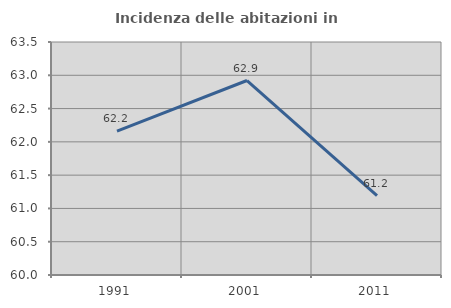
| Category | Incidenza delle abitazioni in proprietà  |
|---|---|
| 1991.0 | 62.162 |
| 2001.0 | 62.921 |
| 2011.0 | 61.194 |